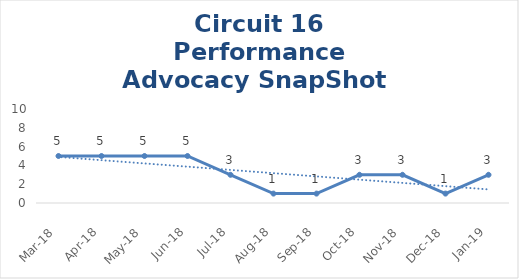
| Category | Circuit 16 |
|---|---|
| Mar-18 | 5 |
| Apr-18 | 5 |
| May-18 | 5 |
| Jun-18 | 5 |
| Jul-18 | 3 |
| Aug-18 | 1 |
| Sep-18 | 1 |
| Oct-18 | 3 |
| Nov-18 | 3 |
| Dec-18 | 1 |
| Jan-19 | 3 |